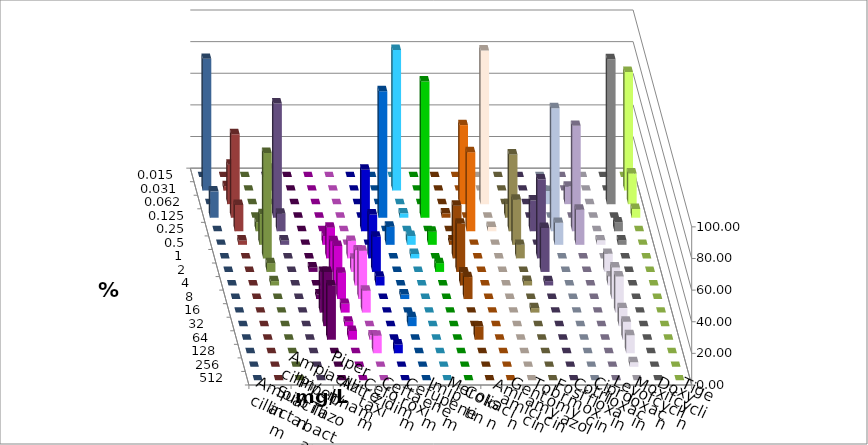
| Category | Ampicillin | Ampicillin/ Sulbactam | Piperacillin | Piperacillin/ Tazobactam | Aztreonam | Cefotaxim | Ceftazidim | Cefuroxim | Imipenem | Meropenem | Colistin | Amikacin | Gentamicin | Tobramycin | Fosfomycin | Cotrimoxazol | Ciprofloxacin | Levofloxacin | Moxifloxacin | Doxycyclin | Tigecyclin |
|---|---|---|---|---|---|---|---|---|---|---|---|---|---|---|---|---|---|---|---|---|---|
| 0.015 | 0 | 0 | 0 | 0 | 0 | 0 | 0 | 0 | 0 | 0 | 0 | 0 | 0 | 0 | 0 | 0 | 0 | 0 | 0 | 0 | 0 |
| 0.031 | 0 | 0 | 0 | 0 | 0 | 88.889 | 0 | 0 | 0 | 0 | 0 | 0 | 0 | 0 | 0 | 0 | 75 | 83.333 | 2.778 | 0 | 13.889 |
| 0.062 | 0 | 0 | 0 | 0 | 0 | 0 | 0 | 0 | 50 | 97.222 | 0 | 0 | 8.333 | 11.111 | 0 | 91.667 | 19.444 | 0 | 25 | 0 | 0 |
| 0.125 | 0 | 0 | 0 | 0 | 80 | 2.778 | 86.111 | 2.778 | 0 | 0 | 8.571 | 0 | 0 | 0 | 0 | 0 | 5.556 | 16.667 | 52.778 | 0 | 72.222 |
| 0.25 | 0 | 0 | 0 | 38.889 | 0 | 0 | 0 | 0 | 50 | 2.778 | 48.571 | 19.444 | 77.778 | 66.667 | 0 | 5.556 | 0 | 0 | 16.667 | 5.556 | 11.111 |
| 0.5 | 0 | 5.556 | 0 | 0 | 11.429 | 5.556 | 8.333 | 2.778 | 0 | 0 | 28.571 | 0 | 13.889 | 22.222 | 2.857 | 2.778 | 0 | 0 | 2.778 | 19.444 | 2.778 |
| 1.0 | 0 | 19.444 | 11.111 | 27.778 | 0 | 2.778 | 0 | 33.333 | 0 | 0 | 8.571 | 50 | 0 | 0 | 0 | 0 | 0 | 0 | 0 | 66.667 | 0 |
| 2.0 | 2.857 | 19.444 | 8.333 | 22.222 | 0 | 0 | 5.556 | 30.556 | 0 | 0 | 0 | 27.778 | 0 | 0 | 11.429 | 0 | 0 | 0 | 0 | 5.556 | 0 |
| 4.0 | 0 | 25 | 22.222 | 5.556 | 0 | 0 | 0 | 8.333 | 0 | 0 | 2.857 | 2.778 | 0 | 0 | 5.714 | 0 | 0 | 0 | 0 | 2.778 | 0 |
| 8.0 | 2.857 | 16.667 | 30.556 | 0 | 2.857 | 0 | 0 | 13.889 | 0 | 0 | 0 | 0 | 0 | 0 | 20 | 0 | 0 | 0 | 0 | 0 | 0 |
| 16.0 | 25.714 | 5.556 | 13.889 | 0 | 0 | 0 | 0 | 0 | 0 | 0 | 2.857 | 0 | 0 | 0 | 22.857 | 0 | 0 | 0 | 0 | 0 | 0 |
| 32.0 | 34.286 | 2.778 | 0 | 0 | 5.714 | 0 | 0 | 0 | 0 | 0 | 0 | 0 | 0 | 0 | 11.429 | 0 | 0 | 0 | 0 | 0 | 0 |
| 64.0 | 34.286 | 5.556 | 2.778 | 0 | 0 | 0 | 0 | 8.333 | 0 | 0 | 0 | 0 | 0 | 0 | 11.429 | 0 | 0 | 0 | 0 | 0 | 0 |
| 128.0 | 0 | 0 | 11.111 | 5.556 | 0 | 0 | 0 | 0 | 0 | 0 | 0 | 0 | 0 | 0 | 11.429 | 0 | 0 | 0 | 0 | 0 | 0 |
| 256.0 | 0 | 0 | 0 | 0 | 0 | 0 | 0 | 0 | 0 | 0 | 0 | 0 | 0 | 0 | 2.857 | 0 | 0 | 0 | 0 | 0 | 0 |
| 512.0 | 0 | 0 | 0 | 0 | 0 | 0 | 0 | 0 | 0 | 0 | 0 | 0 | 0 | 0 | 0 | 0 | 0 | 0 | 0 | 0 | 0 |